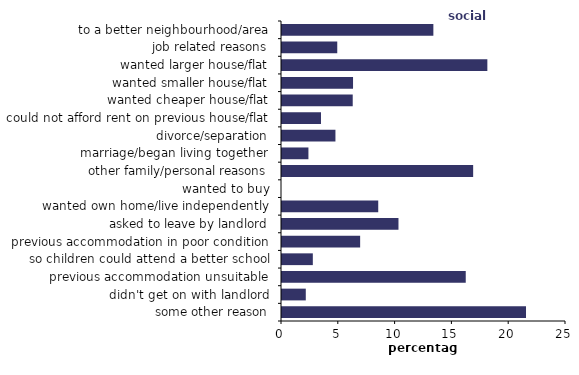
| Category | social renters |
|---|---|
| to a better neighbourhood/area | 13.324 |
| job related reasons | 4.864 |
| wanted larger house/flat | 18.077 |
| wanted smaller house/flat | 6.253 |
| wanted cheaper house/flat | 6.226 |
| could not afford rent on previous house/flat | 3.432 |
| divorce/separation | 4.704 |
| marriage/began living together | 2.327 |
| other family/personal reasons | 16.827 |
| wanted to buy | 0 |
| wanted own home/live independently | 8.471 |
| asked to leave by landlord | 10.253 |
| previous accommodation in poor condition | 6.879 |
| so children could attend a better school | 2.714 |
| previous accommodation unsuitable | 16.175 |
| didn't get on with landlord | 2.094 |
| some other reason | 21.479 |